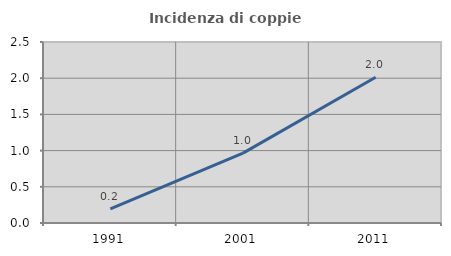
| Category | Incidenza di coppie miste |
|---|---|
| 1991.0 | 0.196 |
| 2001.0 | 0.965 |
| 2011.0 | 2.013 |